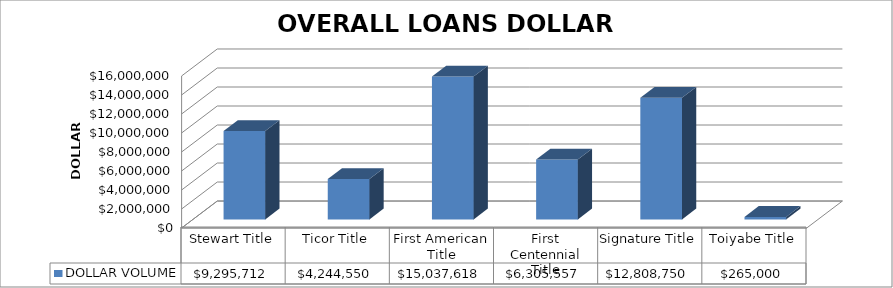
| Category | DOLLAR VOLUME |
|---|---|
| Stewart Title | 9295712 |
| Ticor Title | 4244550 |
| First American Title | 15037618 |
| First Centennial Title | 6305557 |
| Signature Title | 12808750 |
| Toiyabe Title | 265000 |